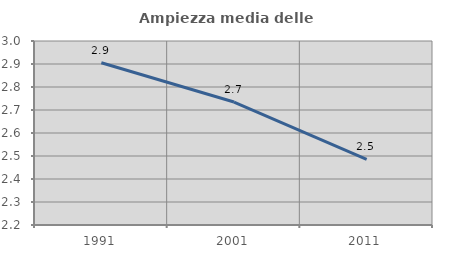
| Category | Ampiezza media delle famiglie |
|---|---|
| 1991.0 | 2.906 |
| 2001.0 | 2.735 |
| 2011.0 | 2.485 |